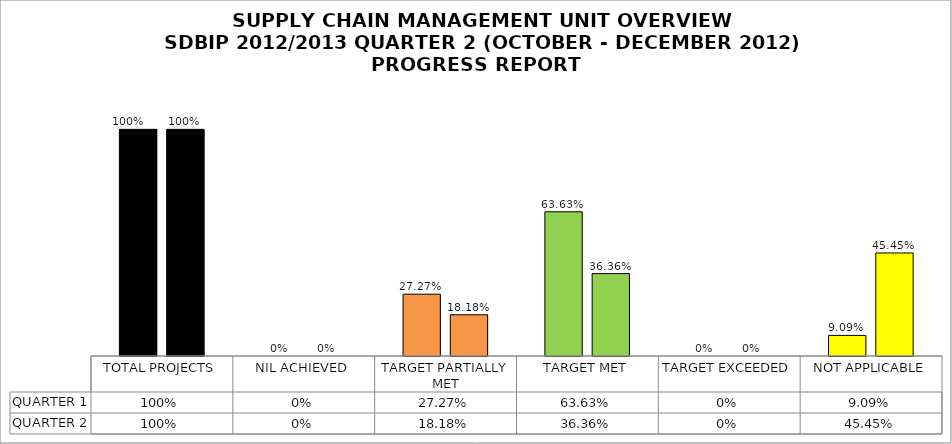
| Category | QUARTER 1 | QUARTER 2 |
|---|---|---|
| TOTAL PROJECTS | 1 | 1 |
| NIL ACHIEVED | 0 | 0 |
| TARGET PARTIALLY MET | 0.273 | 0.182 |
| TARGET MET | 0.636 | 0.364 |
| TARGET EXCEEDED | 0 | 0 |
| NOT APPLICABLE | 0.091 | 0.454 |